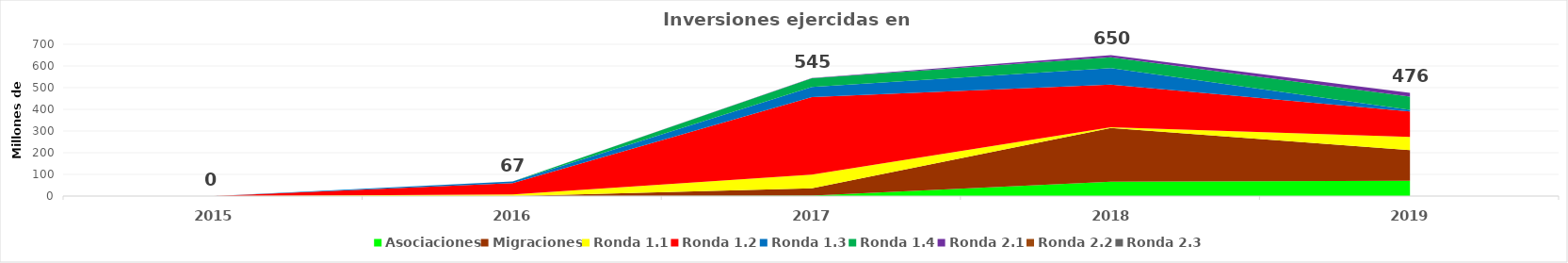
| Category | Series 9 |
|---|---|
| 2015.0 | 0.026 |
| 2016.0 | 67.155 |
| 2017.0 | 544.573 |
| 2018.0 | 650.293 |
| 2019.0 | 476.449 |